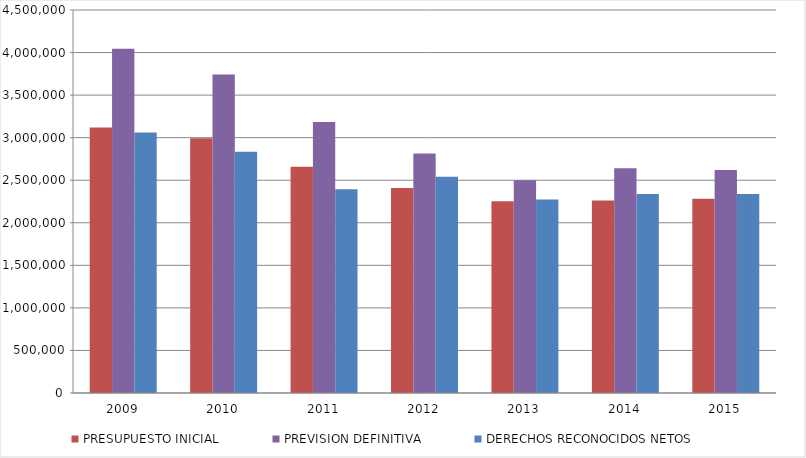
| Category | PRESUPUESTO INICIAL | PREVISION DEFINITIVA | DERECHOS RECONOCIDOS NETOS |
|---|---|---|---|
| 2009.0 | 3119192.039 | 4043462.55 | 3061409.44 |
| 2010.0 | 2993809.334 | 3741837.64 | 2833638.064 |
| 2011.0 | 2658404.732 | 3183967.276 | 2392480.632 |
| 2012.0 | 2407218.064 | 2813727.777 | 2542189.167 |
| 2013.0 | 2251494.132 | 2500420.555 | 2272108.92 |
| 2014.0 | 2262738.711 | 2640789.018 | 2338899.754 |
| 2015.0 | 2283050.748 | 2620836.624 | 2337248.453 |